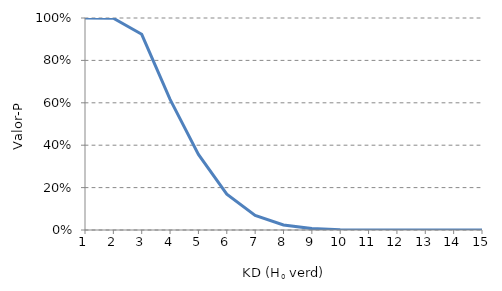
| Category | Valor-P (KD >= KDobs) |
|---|---|
| 1.0 | 1 |
| 2.0 | 0.999 |
| 3.0 | 0.923 |
| 4.0 | 0.616 |
| 5.0 | 0.357 |
| 6.0 | 0.169 |
| 7.0 | 0.069 |
| 8.0 | 0.024 |
| 9.0 | 0.007 |
| 10.0 | 0.002 |
| 11.0 | 0 |
| 12.0 | 0 |
| 13.0 | 0 |
| 14.0 | 0 |
| 15.0 | 0 |